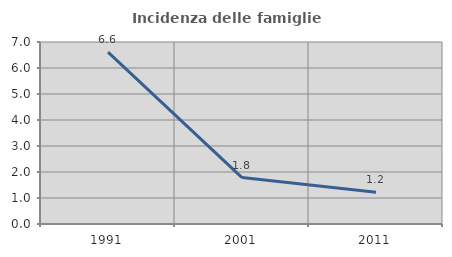
| Category | Incidenza delle famiglie numerose |
|---|---|
| 1991.0 | 6.61 |
| 2001.0 | 1.786 |
| 2011.0 | 1.224 |